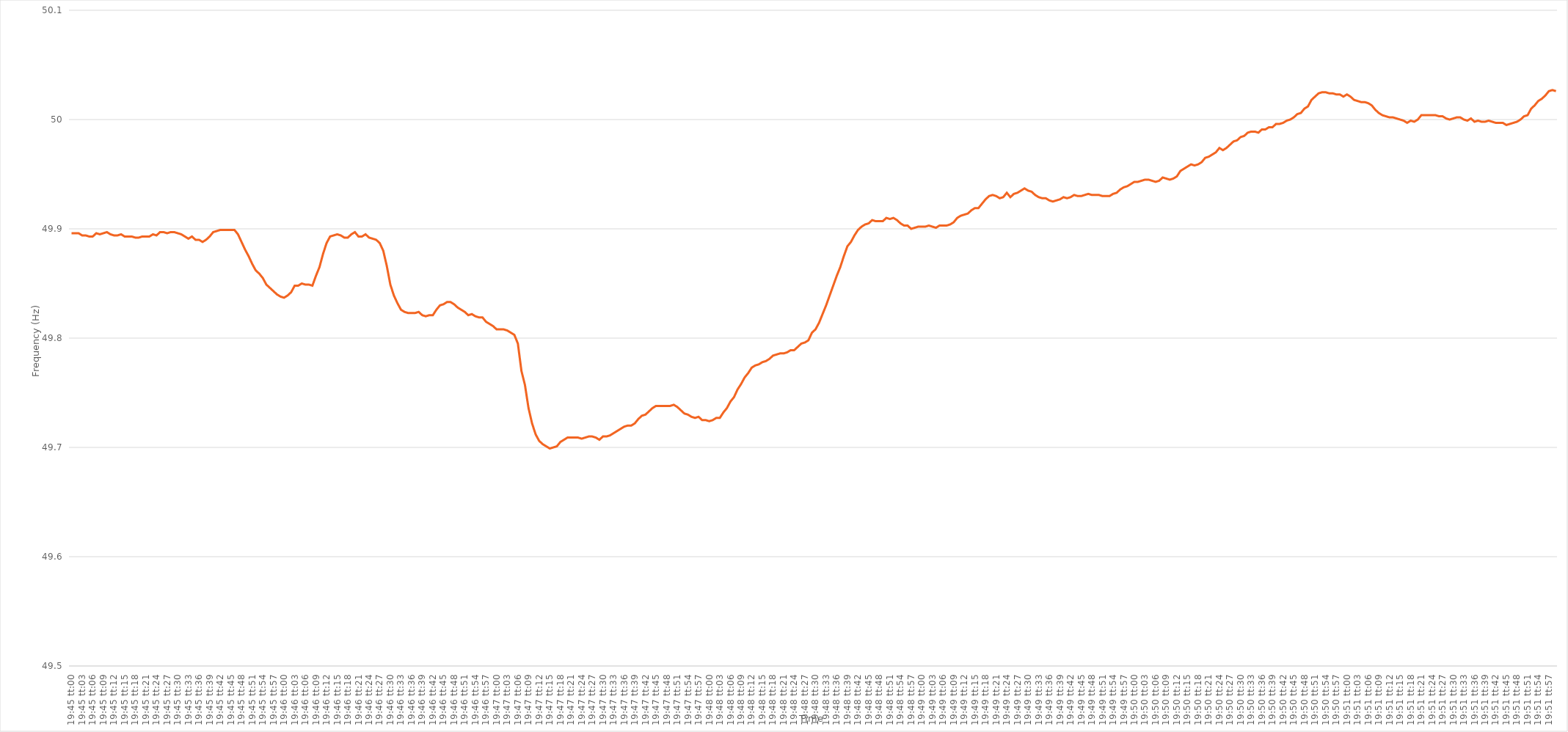
| Category | Series 0 |
|---|---|
| 0.8229166666666666 | 49.896 |
| 0.8229282407407408 | 49.896 |
| 0.8229398148148147 | 49.896 |
| 0.8229513888888889 | 49.894 |
| 0.822962962962963 | 49.894 |
| 0.822974537037037 | 49.893 |
| 0.8229861111111111 | 49.893 |
| 0.8229976851851851 | 49.896 |
| 0.8230092592592593 | 49.895 |
| 0.8230208333333334 | 49.896 |
| 0.8230324074074074 | 49.897 |
| 0.8230439814814815 | 49.895 |
| 0.8230555555555555 | 49.894 |
| 0.8230671296296297 | 49.894 |
| 0.8230787037037036 | 49.895 |
| 0.8230902777777778 | 49.893 |
| 0.8231018518518519 | 49.893 |
| 0.823113425925926 | 49.893 |
| 0.823125 | 49.892 |
| 0.823136574074074 | 49.892 |
| 0.8231481481481482 | 49.893 |
| 0.8231597222222223 | 49.893 |
| 0.8231712962962963 | 49.893 |
| 0.8231828703703704 | 49.895 |
| 0.8231944444444445 | 49.894 |
| 0.8232060185185185 | 49.897 |
| 0.8232175925925925 | 49.897 |
| 0.8232291666666667 | 49.896 |
| 0.8232407407407408 | 49.897 |
| 0.8232523148148148 | 49.897 |
| 0.8232638888888889 | 49.896 |
| 0.823275462962963 | 49.895 |
| 0.8232870370370371 | 49.893 |
| 0.823298611111111 | 49.891 |
| 0.8233101851851852 | 49.893 |
| 0.8233217592592593 | 49.89 |
| 0.8233333333333334 | 49.89 |
| 0.8233449074074074 | 49.888 |
| 0.8233564814814814 | 49.89 |
| 0.8233680555555556 | 49.893 |
| 0.8233796296296297 | 49.897 |
| 0.8233912037037037 | 49.898 |
| 0.8234027777777778 | 49.899 |
| 0.8234143518518519 | 49.899 |
| 0.8234259259259259 | 49.899 |
| 0.8234374999999999 | 49.899 |
| 0.8234490740740741 | 49.899 |
| 0.8234606481481482 | 49.895 |
| 0.8234722222222222 | 49.888 |
| 0.8234837962962963 | 49.881 |
| 0.8234953703703703 | 49.875 |
| 0.8235069444444445 | 49.868 |
| 0.8235185185185184 | 49.862 |
| 0.8235300925925926 | 49.859 |
| 0.8235416666666667 | 49.855 |
| 0.8235532407407408 | 49.849 |
| 0.8235648148148148 | 49.846 |
| 0.8235763888888888 | 49.843 |
| 0.823587962962963 | 49.84 |
| 0.8235995370370371 | 49.838 |
| 0.8236111111111111 | 49.837 |
| 0.8236226851851852 | 49.839 |
| 0.8236342592592593 | 49.842 |
| 0.8236458333333333 | 49.848 |
| 0.8236574074074073 | 49.848 |
| 0.8236689814814815 | 49.85 |
| 0.8236805555555556 | 49.849 |
| 0.8236921296296296 | 49.849 |
| 0.8237037037037037 | 49.848 |
| 0.8237152777777778 | 49.857 |
| 0.8237268518518519 | 49.865 |
| 0.8237384259259258 | 49.877 |
| 0.82375 | 49.887 |
| 0.8237615740740741 | 49.893 |
| 0.8237731481481482 | 49.894 |
| 0.8237847222222222 | 49.895 |
| 0.8237962962962962 | 49.894 |
| 0.8238078703703704 | 49.892 |
| 0.8238194444444445 | 49.892 |
| 0.8238310185185185 | 49.895 |
| 0.8238425925925926 | 49.897 |
| 0.8238541666666667 | 49.893 |
| 0.8238657407407407 | 49.893 |
| 0.8238773148148147 | 49.895 |
| 0.8238888888888889 | 49.892 |
| 0.823900462962963 | 49.891 |
| 0.823912037037037 | 49.89 |
| 0.8239236111111111 | 49.887 |
| 0.8239351851851852 | 49.88 |
| 0.8239467592592593 | 49.866 |
| 0.8239583333333332 | 49.849 |
| 0.8239699074074074 | 49.839 |
| 0.8239814814814815 | 49.832 |
| 0.8239930555555556 | 49.826 |
| 0.8240046296296296 | 49.824 |
| 0.8240162037037037 | 49.823 |
| 0.8240277777777778 | 49.823 |
| 0.824039351851852 | 49.823 |
| 0.8240509259259259 | 49.824 |
| 0.8240625 | 49.821 |
| 0.8240740740740741 | 49.82 |
| 0.8240856481481481 | 49.821 |
| 0.8240972222222221 | 49.821 |
| 0.8241087962962963 | 49.826 |
| 0.8241203703703704 | 49.83 |
| 0.8241319444444444 | 49.831 |
| 0.8241435185185185 | 49.833 |
| 0.8241550925925926 | 49.833 |
| 0.8241666666666667 | 49.831 |
| 0.8241782407407406 | 49.828 |
| 0.8241898148148148 | 49.826 |
| 0.8242013888888889 | 49.824 |
| 0.824212962962963 | 49.821 |
| 0.824224537037037 | 49.822 |
| 0.8242361111111111 | 49.82 |
| 0.8242476851851852 | 49.819 |
| 0.8242592592592594 | 49.819 |
| 0.8242708333333333 | 49.815 |
| 0.8242824074074074 | 49.813 |
| 0.8242939814814815 | 49.811 |
| 0.8243055555555556 | 49.808 |
| 0.8243171296296296 | 49.808 |
| 0.8243287037037037 | 49.808 |
| 0.8243402777777779 | 49.807 |
| 0.8243518518518519 | 49.805 |
| 0.8243634259259259 | 49.803 |
| 0.824375 | 49.795 |
| 0.8243865740740741 | 49.77 |
| 0.824398148148148 | 49.757 |
| 0.8244097222222222 | 49.736 |
| 0.8244212962962963 | 49.722 |
| 0.8244328703703704 | 49.712 |
| 0.8244444444444444 | 49.706 |
| 0.8244560185185185 | 49.703 |
| 0.8244675925925926 | 49.701 |
| 0.8244791666666668 | 49.699 |
| 0.8244907407407407 | 49.7 |
| 0.8245023148148148 | 49.701 |
| 0.8245138888888889 | 49.705 |
| 0.824525462962963 | 49.707 |
| 0.824537037037037 | 49.709 |
| 0.8245486111111111 | 49.709 |
| 0.8245601851851853 | 49.709 |
| 0.8245717592592593 | 49.709 |
| 0.8245833333333333 | 49.708 |
| 0.8245949074074074 | 49.709 |
| 0.8246064814814815 | 49.71 |
| 0.8246180555555555 | 49.71 |
| 0.8246296296296296 | 49.709 |
| 0.8246412037037038 | 49.707 |
| 0.8246527777777778 | 49.71 |
| 0.8246643518518518 | 49.71 |
| 0.8246759259259259 | 49.711 |
| 0.8246875 | 49.713 |
| 0.8246990740740742 | 49.715 |
| 0.8247106481481481 | 49.717 |
| 0.8247222222222222 | 49.719 |
| 0.8247337962962963 | 49.72 |
| 0.8247453703703704 | 49.72 |
| 0.8247569444444444 | 49.722 |
| 0.8247685185185185 | 49.726 |
| 0.8247800925925927 | 49.729 |
| 0.8247916666666667 | 49.73 |
| 0.8248032407407407 | 49.733 |
| 0.8248148148148148 | 49.736 |
| 0.8248263888888889 | 49.738 |
| 0.8248379629629629 | 49.738 |
| 0.824849537037037 | 49.738 |
| 0.8248611111111112 | 49.738 |
| 0.8248726851851852 | 49.738 |
| 0.8248842592592592 | 49.739 |
| 0.8248958333333333 | 49.737 |
| 0.8249074074074074 | 49.734 |
| 0.8249189814814816 | 49.731 |
| 0.8249305555555555 | 49.73 |
| 0.8249421296296297 | 49.728 |
| 0.8249537037037037 | 49.727 |
| 0.8249652777777778 | 49.728 |
| 0.8249768518518518 | 49.725 |
| 0.8249884259259259 | 49.725 |
| 0.8250000000000001 | 49.724 |
| 0.8250115740740741 | 49.725 |
| 0.8250231481481481 | 49.727 |
| 0.8250347222222222 | 49.727 |
| 0.8250462962962963 | 49.732 |
| 0.8250578703703703 | 49.736 |
| 0.8250694444444444 | 49.742 |
| 0.8250810185185186 | 49.746 |
| 0.8250925925925926 | 49.753 |
| 0.8251041666666666 | 49.758 |
| 0.8251157407407407 | 49.764 |
| 0.8251273148148148 | 49.768 |
| 0.825138888888889 | 49.773 |
| 0.8251504629629629 | 49.775 |
| 0.825162037037037 | 49.776 |
| 0.8251736111111111 | 49.778 |
| 0.8251851851851852 | 49.779 |
| 0.8251967592592592 | 49.781 |
| 0.8252083333333333 | 49.784 |
| 0.8252199074074075 | 49.785 |
| 0.8252314814814815 | 49.786 |
| 0.8252430555555555 | 49.786 |
| 0.8252546296296296 | 49.787 |
| 0.8252662037037037 | 49.789 |
| 0.8252777777777777 | 49.789 |
| 0.8252893518518518 | 49.792 |
| 0.825300925925926 | 49.795 |
| 0.8253125 | 49.796 |
| 0.825324074074074 | 49.798 |
| 0.8253356481481481 | 49.805 |
| 0.8253472222222222 | 49.808 |
| 0.8253587962962964 | 49.814 |
| 0.8253703703703703 | 49.822 |
| 0.8253819444444445 | 49.83 |
| 0.8253935185185185 | 49.839 |
| 0.8254050925925926 | 49.848 |
| 0.8254166666666666 | 49.857 |
| 0.8254282407407407 | 49.865 |
| 0.8254398148148149 | 49.875 |
| 0.8254513888888889 | 49.884 |
| 0.825462962962963 | 49.888 |
| 0.825474537037037 | 49.894 |
| 0.8254861111111111 | 49.899 |
| 0.8254976851851853 | 49.902 |
| 0.8255092592592592 | 49.904 |
| 0.8255208333333334 | 49.905 |
| 0.8255324074074074 | 49.908 |
| 0.8255439814814814 | 49.907 |
| 0.8255555555555555 | 49.907 |
| 0.8255671296296296 | 49.907 |
| 0.8255787037037038 | 49.91 |
| 0.8255902777777777 | 49.909 |
| 0.8256018518518519 | 49.91 |
| 0.8256134259259259 | 49.908 |
| 0.825625 | 49.905 |
| 0.825636574074074 | 49.903 |
| 0.8256481481481481 | 49.903 |
| 0.8256597222222223 | 49.9 |
| 0.8256712962962963 | 49.901 |
| 0.8256828703703704 | 49.902 |
| 0.8256944444444444 | 49.902 |
| 0.8257060185185185 | 49.902 |
| 0.8257175925925927 | 49.903 |
| 0.8257291666666666 | 49.902 |
| 0.8257407407407408 | 49.901 |
| 0.8257523148148148 | 49.903 |
| 0.825763888888889 | 49.903 |
| 0.8257754629629629 | 49.903 |
| 0.825787037037037 | 49.904 |
| 0.8257986111111112 | 49.906 |
| 0.8258101851851851 | 49.91 |
| 0.8258217592592593 | 49.912 |
| 0.8258333333333333 | 49.913 |
| 0.8258449074074075 | 49.914 |
| 0.8258564814814814 | 49.917 |
| 0.8258680555555555 | 49.919 |
| 0.8258796296296297 | 49.919 |
| 0.8258912037037037 | 49.923 |
| 0.8259027777777778 | 49.927 |
| 0.8259143518518518 | 49.93 |
| 0.825925925925926 | 49.931 |
| 0.8259375000000001 | 49.93 |
| 0.825949074074074 | 49.928 |
| 0.8259606481481482 | 49.929 |
| 0.8259722222222222 | 49.933 |
| 0.8259837962962964 | 49.929 |
| 0.8259953703703703 | 49.932 |
| 0.8260069444444444 | 49.933 |
| 0.8260185185185186 | 49.935 |
| 0.8260300925925925 | 49.937 |
| 0.8260416666666667 | 49.935 |
| 0.8260532407407407 | 49.934 |
| 0.8260648148148149 | 49.931 |
| 0.8260763888888888 | 49.929 |
| 0.8260879629629629 | 49.928 |
| 0.8260995370370371 | 49.928 |
| 0.8261111111111111 | 49.926 |
| 0.8261226851851852 | 49.925 |
| 0.8261342592592592 | 49.926 |
| 0.8261458333333334 | 49.927 |
| 0.8261574074074075 | 49.929 |
| 0.8261689814814814 | 49.928 |
| 0.8261805555555556 | 49.929 |
| 0.8261921296296296 | 49.931 |
| 0.8262037037037038 | 49.93 |
| 0.8262152777777777 | 49.93 |
| 0.8262268518518519 | 49.931 |
| 0.826238425925926 | 49.932 |
| 0.8262499999999999 | 49.931 |
| 0.8262615740740741 | 49.931 |
| 0.8262731481481481 | 49.931 |
| 0.8262847222222223 | 49.93 |
| 0.8262962962962962 | 49.93 |
| 0.8263078703703703 | 49.93 |
| 0.8263194444444445 | 49.932 |
| 0.8263310185185185 | 49.933 |
| 0.8263425925925926 | 49.936 |
| 0.8263541666666666 | 49.938 |
| 0.8263657407407408 | 49.939 |
| 0.8263773148148149 | 49.941 |
| 0.8263888888888888 | 49.943 |
| 0.826400462962963 | 49.943 |
| 0.826412037037037 | 49.944 |
| 0.8264236111111112 | 49.945 |
| 0.8264351851851851 | 49.945 |
| 0.8264467592592593 | 49.944 |
| 0.8264583333333334 | 49.943 |
| 0.8264699074074073 | 49.944 |
| 0.8264814814814815 | 49.947 |
| 0.8264930555555555 | 49.946 |
| 0.8265046296296297 | 49.945 |
| 0.8265162037037036 | 49.946 |
| 0.8265277777777778 | 49.948 |
| 0.8265393518518519 | 49.953 |
| 0.8265509259259259 | 49.955 |
| 0.8265625 | 49.957 |
| 0.826574074074074 | 49.959 |
| 0.8265856481481482 | 49.958 |
| 0.8265972222222223 | 49.959 |
| 0.8266087962962962 | 49.961 |
| 0.8266203703703704 | 49.965 |
| 0.8266319444444444 | 49.966 |
| 0.8266435185185186 | 49.968 |
| 0.8266550925925925 | 49.97 |
| 0.8266666666666667 | 49.974 |
| 0.8266782407407408 | 49.972 |
| 0.8266898148148147 | 49.974 |
| 0.8267013888888889 | 49.977 |
| 0.8267129629629629 | 49.98 |
| 0.8267245370370371 | 49.981 |
| 0.826736111111111 | 49.984 |
| 0.8267476851851852 | 49.985 |
| 0.8267592592592593 | 49.988 |
| 0.8267708333333333 | 49.989 |
| 0.8267824074074074 | 49.989 |
| 0.8267939814814814 | 49.988 |
| 0.8268055555555556 | 49.991 |
| 0.8268171296296297 | 49.991 |
| 0.8268287037037036 | 49.993 |
| 0.8268402777777778 | 49.993 |
| 0.8268518518518518 | 49.996 |
| 0.826863425925926 | 49.996 |
| 0.8268749999999999 | 49.997 |
| 0.8268865740740741 | 49.999 |
| 0.8268981481481482 | 50 |
| 0.8269097222222223 | 50.002 |
| 0.8269212962962963 | 50.005 |
| 0.8269328703703703 | 50.006 |
| 0.8269444444444445 | 50.01 |
| 0.8269560185185186 | 50.012 |
| 0.8269675925925926 | 50.018 |
| 0.8269791666666667 | 50.021 |
| 0.8269907407407407 | 50.024 |
| 0.8270023148148148 | 50.025 |
| 0.8270138888888888 | 50.025 |
| 0.827025462962963 | 50.024 |
| 0.8270370370370371 | 50.024 |
| 0.827048611111111 | 50.023 |
| 0.8270601851851852 | 50.023 |
| 0.8270717592592592 | 50.021 |
| 0.8270833333333334 | 50.023 |
| 0.8270949074074073 | 50.021 |
| 0.8271064814814815 | 50.018 |
| 0.8271180555555556 | 50.017 |
| 0.8271296296296297 | 50.016 |
| 0.8271412037037037 | 50.016 |
| 0.8271527777777777 | 50.015 |
| 0.8271643518518519 | 50.013 |
| 0.827175925925926 | 50.009 |
| 0.8271875 | 50.006 |
| 0.8271990740740741 | 50.004 |
| 0.8272106481481482 | 50.003 |
| 0.8272222222222222 | 50.002 |
| 0.8272337962962962 | 50.002 |
| 0.8272453703703704 | 50.001 |
| 0.8272569444444445 | 50 |
| 0.8272685185185185 | 49.999 |
| 0.8272800925925926 | 49.997 |
| 0.8272916666666666 | 49.999 |
| 0.8273032407407408 | 49.998 |
| 0.8273148148148147 | 50 |
| 0.8273263888888889 | 50.004 |
| 0.827337962962963 | 50.004 |
| 0.8273495370370371 | 50.004 |
| 0.8273611111111111 | 50.004 |
| 0.8273726851851851 | 50.004 |
| 0.8273842592592593 | 50.003 |
| 0.8273958333333334 | 50.003 |
| 0.8274074074074074 | 50.001 |
| 0.8274189814814815 | 50 |
| 0.8274305555555556 | 50.001 |
| 0.8274421296296296 | 50.002 |
| 0.8274537037037036 | 50.002 |
| 0.8274652777777778 | 50 |
| 0.8274768518518519 | 49.999 |
| 0.8274884259259259 | 50.001 |
| 0.8275 | 49.998 |
| 0.827511574074074 | 49.999 |
| 0.8275231481481482 | 49.998 |
| 0.8275347222222221 | 49.998 |
| 0.8275462962962963 | 49.999 |
| 0.8275578703703704 | 49.998 |
| 0.8275694444444445 | 49.997 |
| 0.8275810185185185 | 49.997 |
| 0.8275925925925925 | 49.997 |
| 0.8276041666666667 | 49.995 |
| 0.8276157407407408 | 49.996 |
| 0.8276273148148148 | 49.997 |
| 0.8276388888888889 | 49.998 |
| 0.827650462962963 | 50 |
| 0.827662037037037 | 50.003 |
| 0.827673611111111 | 50.004 |
| 0.8276851851851852 | 50.01 |
| 0.8276967592592593 | 50.013 |
| 0.8277083333333333 | 50.017 |
| 0.8277199074074074 | 50.019 |
| 0.8277314814814815 | 50.022 |
| 0.8277430555555556 | 50.026 |
| 0.8277546296296295 | 50.027 |
| 0.8277662037037037 | 50.026 |